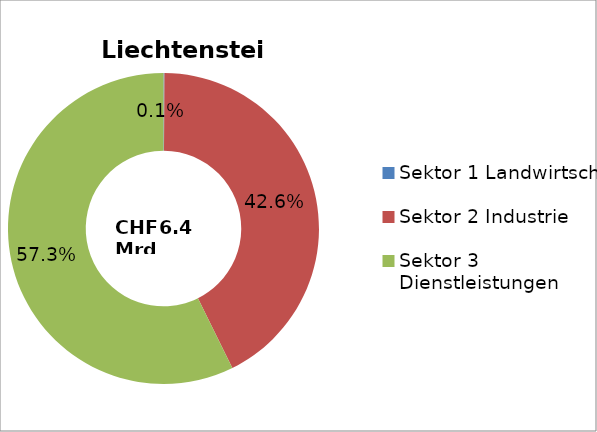
| Category | Liechtenstein |
|---|---|
| Sektor 1 Landwirtschaft | 0.001 |
| Sektor 2 Industrie | 0.426 |
| Sektor 3 Dienstleistungen | 0.573 |